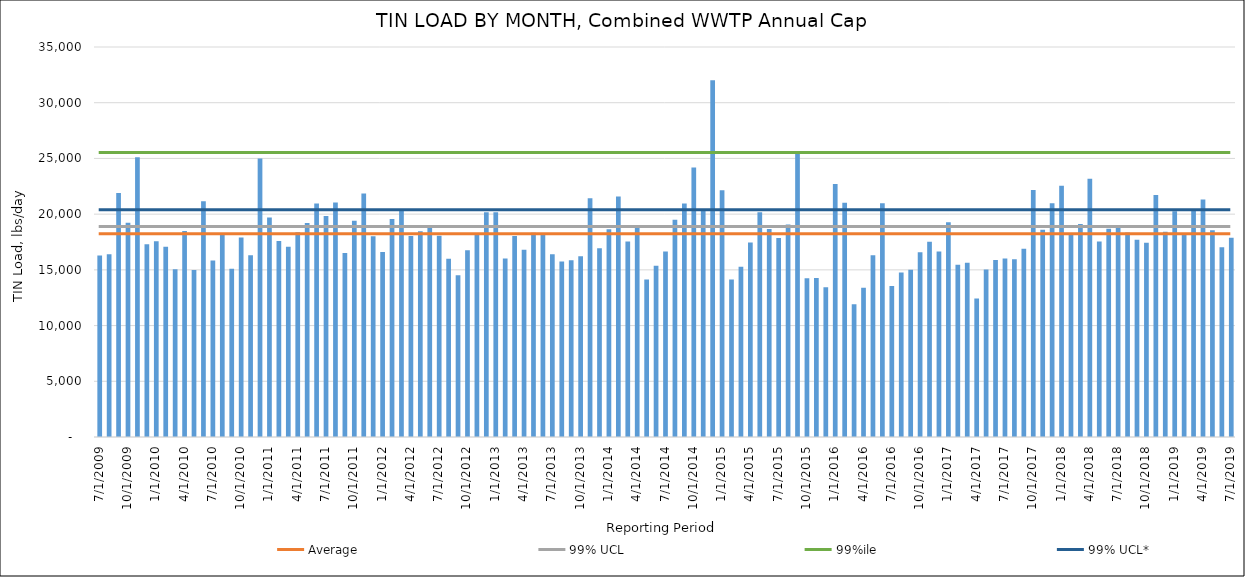
| Category | Series 0 |
|---|---|
| 7/31/09 | 16287.214 |
| 8/31/09 | 16393.016 |
| 9/30/09 | 21900.907 |
| 10/31/09 | 19228.082 |
| 11/30/09 | 25109.672 |
| 12/31/09 | 17305.638 |
| 1/31/10 | 17562.403 |
| 2/28/10 | 17069.565 |
| 3/31/10 | 15054.007 |
| 4/30/10 | 18489.96 |
| 5/31/10 | 14984.572 |
| 6/30/10 | 21158.193 |
| 7/31/10 | 15831.48 |
| 8/31/10 | 18200.295 |
| 9/30/10 | 15107.676 |
| 10/31/10 | 17910.344 |
| 11/30/10 | 16319.795 |
| 12/31/10 | 24998.866 |
| 1/31/11 | 19698.626 |
| 2/28/11 | 17585.266 |
| 3/31/11 | 17070.312 |
| 4/30/11 | 18385.659 |
| 5/31/11 | 19212.077 |
| 6/30/11 | 20956.694 |
| 7/31/11 | 19825.238 |
| 8/31/11 | 21045.485 |
| 9/30/11 | 16520.206 |
| 10/31/11 | 19417.317 |
| 11/30/11 | 21848.525 |
| 12/31/11 | 18023.547 |
| 1/31/12 | 16604.47 |
| 2/29/12 | 19553.669 |
| 3/31/12 | 20374.353 |
| 4/30/12 | 18034.551 |
| 5/31/12 | 18473.705 |
| 6/30/12 | 18838.699 |
| 7/31/12 | 18062.797 |
| 8/31/12 | 15996.389 |
| 9/30/12 | 14519.646 |
| 10/31/12 | 16770.16 |
| 11/30/12 | 18257.351 |
| 12/31/12 | 20180.231 |
| 1/31/13 | 20177.903 |
| 2/28/13 | 16020.664 |
| 3/31/13 | 18042.975 |
| 4/30/13 | 16808.381 |
| 5/31/13 | 18339.11 |
| 6/30/13 | 18274.977 |
| 7/31/13 | 16411.139 |
| 8/31/13 | 15759.663 |
| 9/30/13 | 15852.869 |
| 10/31/13 | 16219.045 |
| 11/30/13 | 21436.47 |
| 12/31/13 | 16936.622 |
| 1/31/14 | 18651.059 |
| 2/28/14 | 21589.067 |
| 3/31/14 | 17547.886 |
| 4/30/14 | 19009.039 |
| 5/31/14 | 14140.103 |
| 6/30/14 | 15365.197 |
| 7/31/14 | 16639.196 |
| 8/31/14 | 19497.776 |
| 9/30/14 | 20949.086 |
| 10/31/14 | 24185.877 |
| 11/30/14 | 20375.12 |
| 12/31/14 | 32022.844 |
| 1/31/15 | 22141.055 |
| 2/28/15 | 14145.292 |
| 3/31/15 | 15280.659 |
| 4/30/15 | 17456.488 |
| 5/31/15 | 20171.479 |
| 6/30/15 | 18667.82 |
| 7/31/15 | 17868.191 |
| 8/31/15 | 19063.921 |
| 9/30/15 | 25640.729 |
| 10/31/15 | 14246.209 |
| 11/30/15 | 14279.716 |
| 12/31/15 | 13436.9 |
| 1/31/16 | 22697.921 |
| 2/29/16 | 21030.742 |
| 3/31/16 | 11916.636 |
| 4/30/16 | 13404.15 |
| 5/31/16 | 16314.162 |
| 6/30/16 | 20985.515 |
| 7/31/16 | 13552.785 |
| 8/31/16 | 14773.754 |
| 9/30/16 | 15011.447 |
| 10/31/16 | 16586.995 |
| 11/30/16 | 17519.622 |
| 12/31/16 | 16654.774 |
| 1/31/17 | 19265.388 |
| 2/28/17 | 15464.775 |
| 3/31/17 | 15636.933 |
| 4/30/17 | 12430.183 |
| 5/31/17 | 15021.595 |
| 6/30/17 | 15873.803 |
| 7/31/17 | 16024.986 |
| 8/31/17 | 15943.362 |
| 9/30/17 | 16897.085 |
| 10/31/17 | 22164.099 |
| 11/30/17 | 18600.697 |
| 12/31/17 | 20972.688 |
| 1/31/18 | 22548.072 |
| 2/28/18 | 18212.484 |
| 3/31/18 | 19115.005 |
| 4/30/18 | 23176.931 |
| 5/31/18 | 17534.073 |
| 6/30/18 | 18696.221 |
| 7/31/18 | 18949.749 |
| 8/31/18 | 18354.77 |
| 9/30/18 | 17694.561 |
| 10/31/18 | 17442.711 |
| 11/30/18 | 21725.49 |
| 12/31/18 | 18425.196 |
| 1/31/19 | 20257.649 |
| 2/28/19 | 18169.482 |
| 3/31/19 | 20295.481 |
| 4/30/19 | 21306.7 |
| 5/31/19 | 18553.381 |
| 6/30/19 | 17026.238 |
| 7/31/19 | 17871.058 |